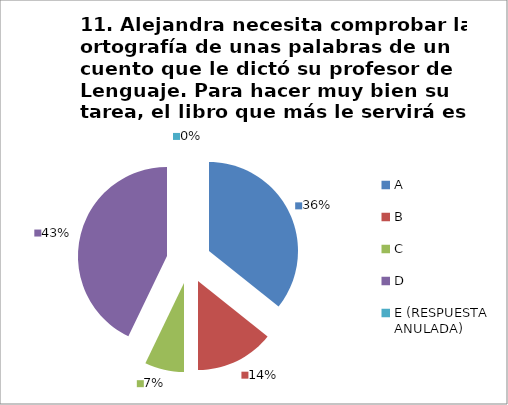
| Category | CANTIDAD DE RESPUESTAS PREGUNTA (11) | PORCENTAJE |
|---|---|---|
| A | 10 | 0.357 |
| B | 4 | 0.143 |
| C | 2 | 0.071 |
| D | 12 | 0.429 |
| E (RESPUESTA ANULADA) | 0 | 0 |